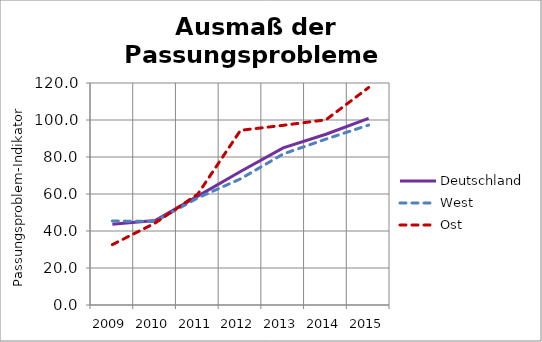
| Category | Deutschland | West | Ost |
|---|---|---|---|
| 2009.0 | 43.679 | 45.433 | 32.643 |
| 2010.0 | 45.694 | 45.127 | 44.263 |
| 2011.0 | 58.844 | 57.887 | 59.937 |
| 2012.0 | 72.155 | 68.177 | 94.409 |
| 2013.0 | 84.903 | 81.642 | 97.125 |
| 2014.0 | 92.308 | 89.67 | 100.11 |
| 2015.0 | 100.865 | 97.264 | 117.553 |